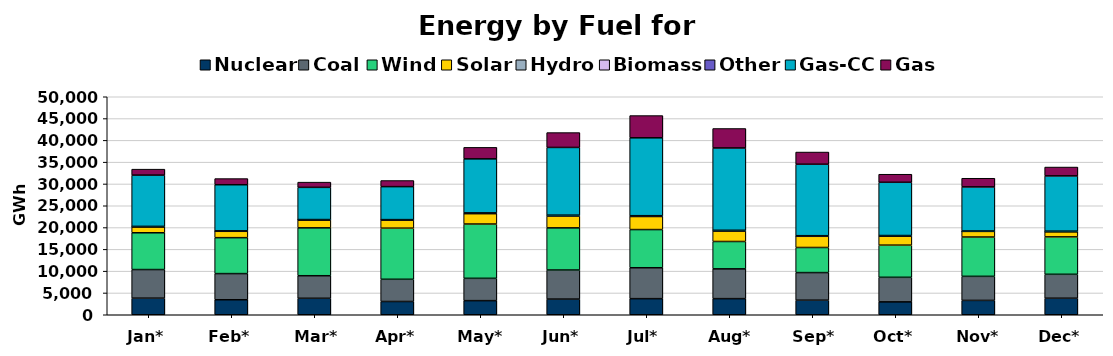
| Category | Nuclear | Coal | Wind | Solar | Hydro | Biomass | Other | Gas-CC | Gas |
|---|---|---|---|---|---|---|---|---|---|
| Jan* | 3803 | 6564 | 8434 | 1368 | 13 | 60 | 29 | 11760 | 1364 |
| Feb* | 3437 | 6000 | 8245 | 1460 | 13 | 59 | 31 | 10576 | 1409 |
| Mar* | 3778 | 5171 | 10986 | 1821 | 24 | 17 | 36 | 7386 | 1199 |
| Apr* | 3042 | 5096 | 11720 | 1861 | 35 | 22 | 43 | 7567 | 1401 |
| May* | 3237 | 5117 | 12454 | 2391 | 50 | 64 | 55 | 12389 | 2632 |
| Jun* | 3593 | 6670 | 9667 | 2729 | 67 | 69 | 50 | 15530 | 3405 |
| Jul* | 3692 | 7089 | 8755 | 2997 | 57 | 72 | 56 | 17866 | 5101 |
| Aug* | 3697 | 6829 | 6275 | 2425 | 26 | 71 | 51 | 18879 | 4467 |
| Sep* | 3342 | 6328 | 5755 | 2569 | 17 | 68 | 52 | 16398 | 2789 |
| Oct* | 2953 | 5634 | 7375 | 2073 | 15 | 61 | 60 | 12212 | 1848 |
| Nov* | 3292 | 5518 | 9016 | 1303 | 12 | 12 | 57 | 10115 | 1983 |
| Dec* | 3793 | 5486 | 8582 | 1194 | 15 | 49 | 51 | 12679 | 2029 |